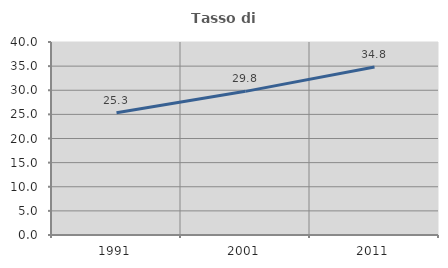
| Category | Tasso di occupazione   |
|---|---|
| 1991.0 | 25.337 |
| 2001.0 | 29.772 |
| 2011.0 | 34.81 |